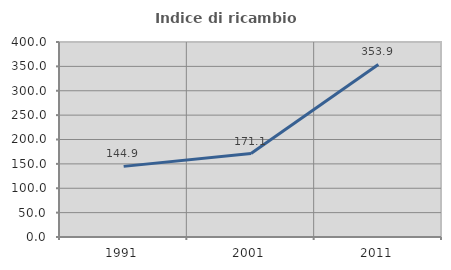
| Category | Indice di ricambio occupazionale  |
|---|---|
| 1991.0 | 144.878 |
| 2001.0 | 171.098 |
| 2011.0 | 353.913 |